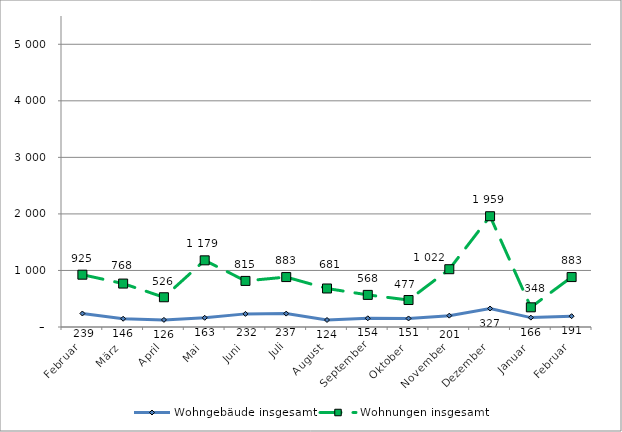
| Category | Wohngebäude insgesamt | Wohnungen insgesamt |
|---|---|---|
| Februar | 239 | 925 |
| März | 146 | 768 |
| April | 126 | 526 |
| Mai | 163 | 1179 |
| Juni | 232 | 815 |
| Juli | 237 | 883 |
| August | 124 | 681 |
| September | 154 | 568 |
| Oktober | 151 | 477 |
| November | 201 | 1022 |
| Dezember | 327 | 1959 |
| Januar | 166 | 348 |
| Februar | 191 | 883 |